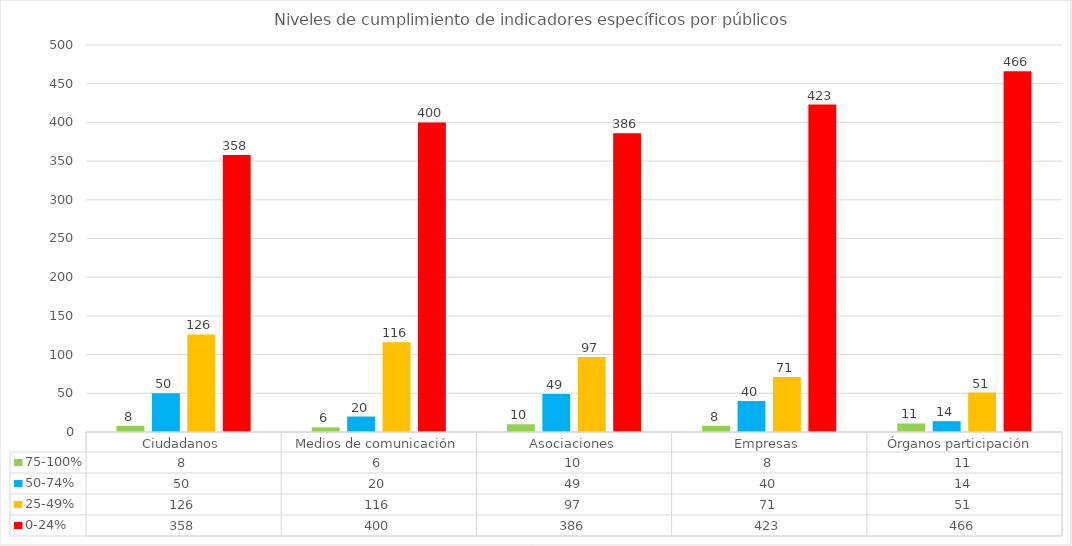
| Category | 75-100% | 50-74% | 25-49% | 0-24% |
|---|---|---|---|---|
| Ciudadanos | 8 | 50 | 126 | 358 |
| Medios de comunicación | 6 | 20 | 116 | 400 |
| Asociaciones | 10 | 49 | 97 | 386 |
| Empresas | 8 | 40 | 71 | 423 |
| Órganos participación  | 11 | 14 | 51 | 466 |